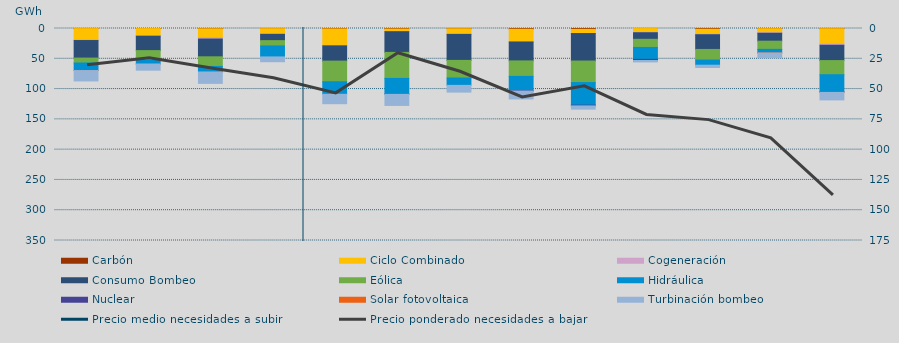
| Category | Carbón | Ciclo Combinado | Cogeneración | Consumo Bombeo | Eólica | Hidráulica | Nuclear | Solar fotovoltaica | Turbinación bombeo |
|---|---|---|---|---|---|---|---|---|---|
| 0 | 154 | 18699.7 | 1014 | 28968.4 | 8108 | 12439.1 | 0 | 43.5 | 17149.3 |
| 1 | 129 | 11392.3 | 1219.7 | 23755.5 | 16146.7 | 6094.5 | 0 | 10.7 | 10042 |
| 2 | 443.1 | 14439.5 | 2552.5 | 29306.4 | 15889.4 | 9269.4 | 0 | 12.8 | 18717.8 |
| 3 | 236 | 8945 | 460.2 | 10384 | 8743.8 | 18173.5 | 0 | 0 | 7919.9 |
| 4 | 624 | 27339.5 | 701.7 | 25190.3 | 34060.3 | 20705 | 0 | 0 | 15547.2 |
| 5 | 808.1 | 4084.4 | 363.4 | 34203 | 42936.4 | 25722.8 | 400 | 0 | 18514.3 |
| 6 | 396 | 9167.3 | 138 | 42992.3 | 28996.8 | 12201.4 | 0 | 0 | 11134.6 |
| 7 | 1103.1 | 21109 | 36 | 31247.5 | 25533.3 | 23731.6 | 466.5 | 0 | 13087.8 |
| 8 | 1344.9 | 6857.9 | 104.3 | 45409 | 35527.1 | 37248.6 | 1255 | 0 | 5407.1 |
| 9 | 90 | 6301.3 | 611.9 | 10829.5 | 13421.8 | 19673.6 | 1892.6 | 0 | 2353 |
| 10 | 1086 | 8544.1 | 632.1 | 24300.1 | 17519.3 | 8524.2 | 0 | 0 | 3741.6 |
| 11 | 269 | 6775.2 | 801.3 | 13110.1 | 13483.2 | 5930 | 0 | 58 | 8083.8 |
| 12 | 301 | 25336.5 | 2018 | 25298.1 | 23328.3 | 28317.4 | 441 | 400.1 | 12441 |